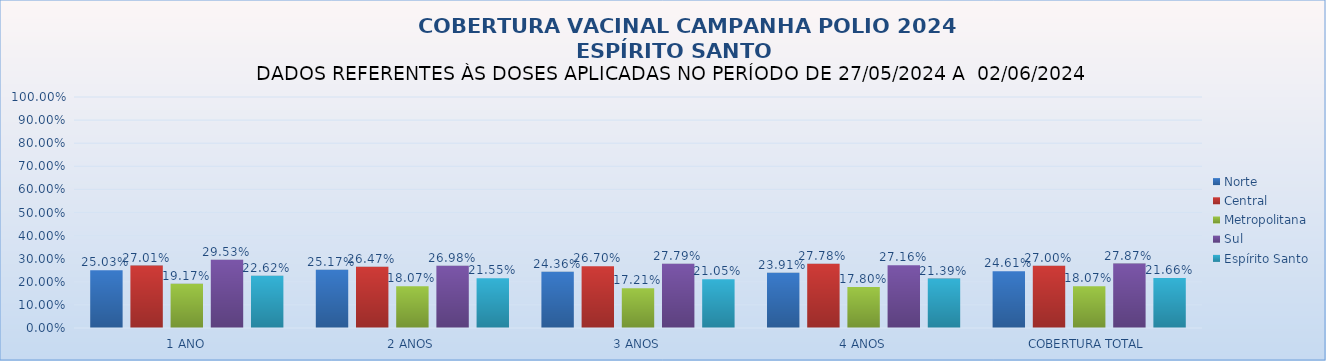
| Category | Norte | Central | Metropolitana | Sul | Espírito Santo |
|---|---|---|---|---|---|
| 1 ANO | 0.25 | 0.27 | 0.192 | 0.295 | 0.226 |
| 2 ANOS | 0.252 | 0.265 | 0.181 | 0.27 | 0.216 |
| 3 ANOS | 0.244 | 0.267 | 0.172 | 0.278 | 0.211 |
| 4 ANOS | 0.239 | 0.278 | 0.178 | 0.272 | 0.214 |
| COBERTURA TOTAL | 0.246 | 0.27 | 0.181 | 0.279 | 0.217 |